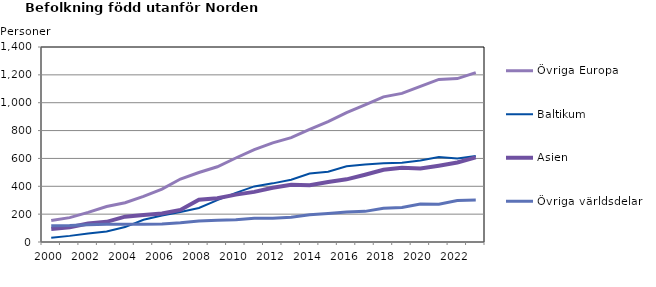
| Category | Övriga Europa | Baltikum | Asien | Övriga världsdelar |
|---|---|---|---|---|
| 2000 | 154 | 30 | 93 | 117 |
| 2001 | 175 | 44 | 106 | 118 |
| 2002 | 213 | 61 | 133 | 124 |
| 2003 | 255 | 76 | 145 | 128 |
| 2004 | 282 | 107 | 182 | 128 |
| 2005 | 327 | 160 | 193 | 127 |
| 2006 | 380 | 190 | 205 | 130 |
| 2007 | 452 | 216 | 230 | 138 |
| 2008 | 499 | 244 | 304 | 151 |
| 2009 | 540 | 301 | 314 | 157 |
| 2010 | 603 | 353 | 340 | 160 |
| 2011 | 663 | 399 | 360 | 170 |
| 2012 | 712 | 421 | 389 | 171 |
| 2013 | 749 | 447 | 411 | 178 |
| 2014 | 808 | 492 | 407 | 195 |
| 2015 | 864 | 504 | 431 | 205 |
| 2016 | 929 | 544 | 450 | 215 |
| 2017 | 985 | 556 | 483 | 220 |
| 2018 | 1042 | 566 | 519 | 243 |
| 2019 | 1067 | 569 | 533 | 248 |
| 2020 | 1117 | 585 | 528 | 272 |
| 2021 | 1167 | 610 | 548 | 271 |
| 2022 | 1173 | 599 | 571 | 298 |
| 2023 | 1216 | 618 | 608 | 301 |